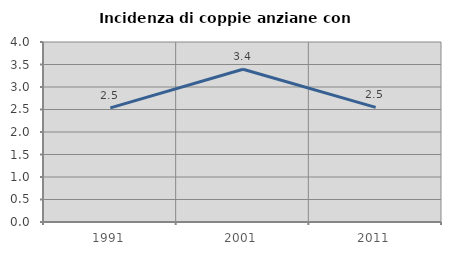
| Category | Incidenza di coppie anziane con figli |
|---|---|
| 1991.0 | 2.535 |
| 2001.0 | 3.396 |
| 2011.0 | 2.546 |